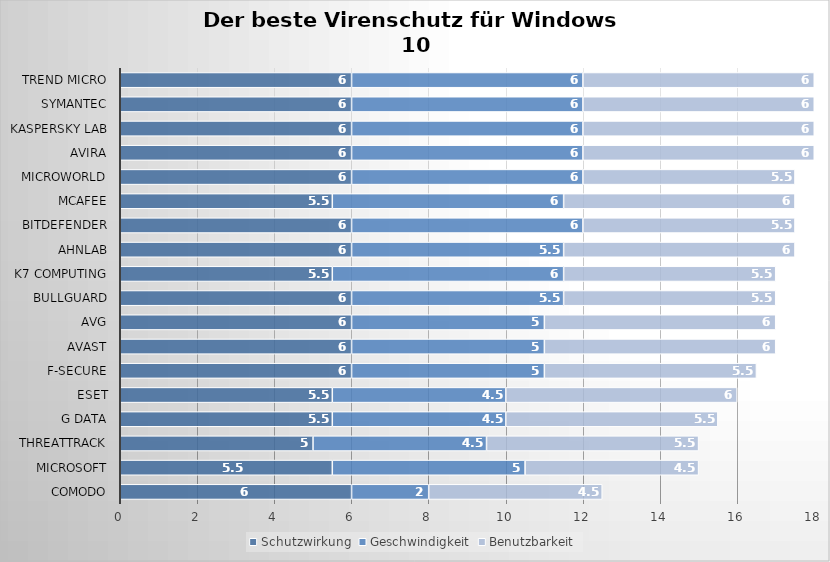
| Category | Schutzwirkung | Geschwindigkeit | Benutzbarkeit |
|---|---|---|---|
| Comodo | 6 | 2 | 4.5 |
| Microsoft | 5.5 | 5 | 4.5 |
| ThreatTrack | 5 | 4.5 | 5.5 |
| G Data | 5.5 | 4.5 | 5.5 |
| ESET | 5.5 | 4.5 | 6 |
| F-Secure | 6 | 5 | 5.5 |
| Avast | 6 | 5 | 6 |
| AVG | 6 | 5 | 6 |
| BullGuard | 6 | 5.5 | 5.5 |
| K7 Computing | 5.5 | 6 | 5.5 |
| AhnLab | 6 | 5.5 | 6 |
| Bitdefender | 6 | 6 | 5.5 |
| McAfee | 5.5 | 6 | 6 |
| Microworld | 6 | 6 | 5.5 |
| Avira | 6 | 6 | 6 |
| Kaspersky Lab | 6 | 6 | 6 |
| Symantec | 6 | 6 | 6 |
| Trend Micro | 6 | 6 | 6 |